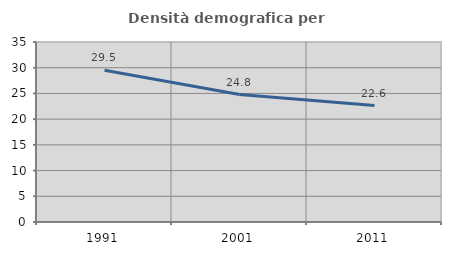
| Category | Densità demografica |
|---|---|
| 1991.0 | 29.501 |
| 2001.0 | 24.784 |
| 2011.0 | 22.632 |